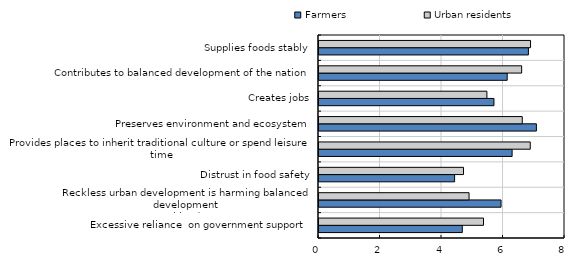
| Category | Farmers | Urban residents |
|---|---|---|
| Excessive reliance  on government support  | 4.66 | 5.35 |
| Reckless urban development is harming balanced development 
or rural landscape  | 5.92 | 4.88 |
| Distrust in food safety | 4.41 | 4.7 |
| Provides places to inherit traditional culture or spend leisure time | 6.28 | 6.87 |
| Preserves environment and ecosystem | 7.07 | 6.61 |
| Creates jobs | 5.69 | 5.46 |
| Contributes to balanced development of the nation | 6.12 | 6.59 |
| Supplies foods stably | 6.81 | 6.88 |